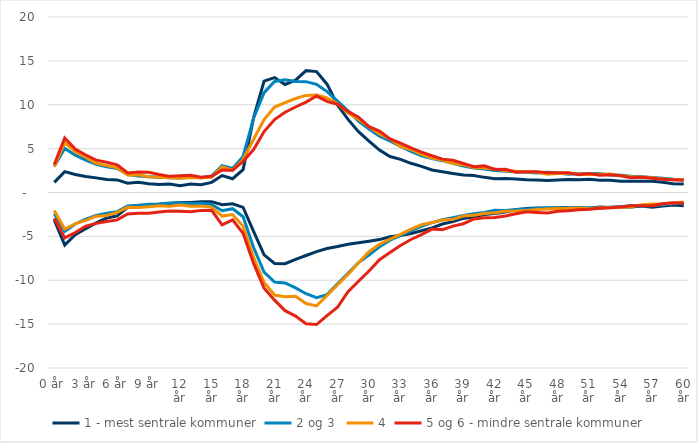
| Category | 1 - mest sentrale kommuner | 2 og 3  | 4 | 5 og 6 - mindre sentrale kommuner |
|---|---|---|---|---|
| 0 år | 1.152 | 2.959 | 2.956 | 3.187 |
| 1 år | 2.379 | 5.029 | 5.688 | 6.206 |
| 2 år | 2.049 | 4.255 | 4.654 | 4.959 |
| 3 år | 1.829 | 3.696 | 4.026 | 4.275 |
| 4 år | 1.667 | 3.211 | 3.327 | 3.692 |
| 5 år | 1.486 | 2.938 | 3.063 | 3.454 |
| 6 år | 1.437 | 2.74 | 2.807 | 3.153 |
| 7 år | 1.058 | 2.036 | 1.988 | 2.224 |
| 8 år | 1.154 | 1.882 | 2.014 | 2.337 |
| 9 år | 1.007 | 1.802 | 1.786 | 2.301 |
| 10 år | 0.913 | 1.746 | 1.736 | 2.044 |
| 11 år | 0.966 | 1.672 | 1.675 | 1.84 |
| 12 år | 0.782 | 1.649 | 1.617 | 1.897 |
| 13 år | 0.967 | 1.73 | 1.72 | 1.964 |
| 14 år | 0.893 | 1.69 | 1.684 | 1.752 |
| 15 år | 1.156 | 1.876 | 1.744 | 1.845 |
| 16 år | 1.932 | 3.05 | 2.905 | 2.574 |
| 17 år | 1.571 | 2.742 | 2.53 | 2.542 |
| 18 år | 2.604 | 4.116 | 3.768 | 3.554 |
| 19 år | 8.527 | 8.465 | 6.061 | 4.897 |
| 20 år | 12.694 | 11.382 | 8.31 | 6.95 |
| 21 år | 13.093 | 12.653 | 9.734 | 8.317 |
| 22 år | 12.312 | 12.834 | 10.24 | 9.143 |
| 23 år | 12.809 | 12.663 | 10.708 | 9.743 |
| 24 år | 13.9 | 12.635 | 11.068 | 10.299 |
| 25 år | 13.774 | 12.329 | 11.124 | 10.993 |
| 26 år | 12.343 | 11.499 | 10.769 | 10.383 |
| 27 år | 9.978 | 10.411 | 10.106 | 10.065 |
| 28 år | 8.328 | 9.314 | 9.043 | 9.243 |
| 29 år | 6.939 | 8.139 | 8.342 | 8.58 |
| 30 år | 5.867 | 7.243 | 7.479 | 7.496 |
| 31 år | 4.84 | 6.43 | 6.671 | 6.99 |
| 32 år | 4.096 | 5.878 | 6.109 | 6.115 |
| 33 år | 3.782 | 5.241 | 5.224 | 5.632 |
| 34 år | 3.326 | 4.685 | 4.906 | 5.089 |
| 35 år | 2.984 | 4.192 | 4.358 | 4.608 |
| 36 år | 2.562 | 3.858 | 3.925 | 4.19 |
| 37 år | 2.368 | 3.629 | 3.697 | 3.802 |
| 38 år | 2.157 | 3.337 | 3.306 | 3.667 |
| 39 år | 1.993 | 3.022 | 3.153 | 3.301 |
| 40 år | 1.948 | 2.788 | 2.85 | 2.933 |
| 41 år | 1.726 | 2.676 | 2.779 | 3.032 |
| 42 år | 1.574 | 2.508 | 2.679 | 2.621 |
| 43 år | 1.606 | 2.432 | 2.477 | 2.655 |
| 44 år | 1.536 | 2.364 | 2.432 | 2.311 |
| 45 år | 1.444 | 2.296 | 2.33 | 2.353 |
| 46 år | 1.434 | 2.22 | 2.326 | 2.366 |
| 47 år | 1.376 | 2.313 | 2.087 | 2.251 |
| 48 år | 1.437 | 2.21 | 2.172 | 2.25 |
| 49 år | 1.482 | 2.074 | 2.205 | 2.239 |
| 50 år | 1.462 | 2.129 | 2.115 | 2.022 |
| 51 år | 1.516 | 2.138 | 2.04 | 2.152 |
| 52 år | 1.388 | 2.157 | 2.083 | 1.97 |
| 53 år | 1.401 | 1.98 | 2.109 | 2.026 |
| 54 år | 1.269 | 1.963 | 1.923 | 1.906 |
| 55 år | 1.294 | 1.853 | 1.8 | 1.68 |
| 56 år | 1.283 | 1.782 | 1.763 | 1.751 |
| 57 år | 1.273 | 1.703 | 1.675 | 1.629 |
| 58 år | 1.17 | 1.637 | 1.527 | 1.521 |
| 59 år | 1.003 | 1.504 | 1.458 | 1.457 |
| 60 år | 0.972 | 1.443 | 1.485 | 1.392 |